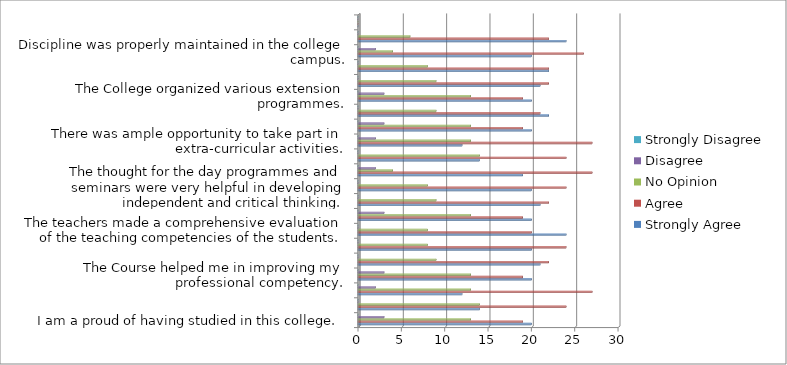
| Category | Strongly Agree  | Agree | No Opinion  | Disagree | Strongly Disagree  |
|---|---|---|---|---|---|
| I am a proud of having studied in this college. | 20 | 19 | 13 | 3 | 0 |
| There existed cordial relation between the staff and students.  | 14 | 24 | 14 | 0 | 0 |
| The institution helped me to fulfill my ambition of becoming a teacher. | 12 | 27 | 13 | 2 | 0 |
| The Course helped me in improving my professional competency. | 20 | 19 | 13 | 3 | 0 |
| The internal assessment of this college is balanced and objective. | 21 | 22 | 9 | 0 | 0 |
| The library facilities are adequate. | 20 | 24 | 8 | 0 | 0 |
| The teachers made a comprehensive evaluation of the teaching competencies of the students. | 24 | 20 | 8 | 0 | 0 |
| The teachers devoted extra time to render guidance. | 20 | 19 | 13 | 3 | 0 |
| Teacher adopted several innovative practices while teaching. | 21 | 22 | 9 | 0 | 0 |
| The thought for the day programmes and seminars were very helpful in developing independent and critical thinking. | 20 | 24 | 8 | 0 | 0 |
| The infrastructure facilities were adequate. | 19 | 27 | 4 | 2 | 0 |
| The educational tour proved to be informative. | 14 | 24 | 14 | 0 | 0 |
| There was ample opportunity to take part in extra-curricular activities. | 12 | 27 | 13 | 2 | 0 |
|  | 20 | 19 | 13 | 3 | 0 |
| There are adequate facilities for physical training and games. | 22 | 21 | 9 | 0 | 0 |
| The College organized various extension programmes. | 20 | 19 | 13 | 3 | 0 |
| The organization of various clubs in the college encouraged me to develop my intellectual and social skill. | 21 | 22 | 9 | 0 | 0 |
| Top Scores in the University Examination are felicitated. | 22 | 22 | 8 | 0 | 0 |
| Discipline was properly maintained in the college campus. | 20 | 26 | 4 | 2 | 0 |
| I often cherished glorious moments of my life in the college. | 24 | 22 | 6 | 0 | 0 |